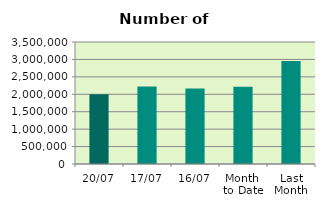
| Category | Series 0 |
|---|---|
| 20/07 | 2001790 |
| 17/07 | 2226308 |
| 16/07 | 2164944 |
| Month 
to Date | 2216949.571 |
| Last
Month | 2956123.091 |